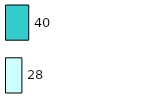
| Category | Series 0 | Series 1 |
|---|---|---|
| 0 | 28 | 40 |